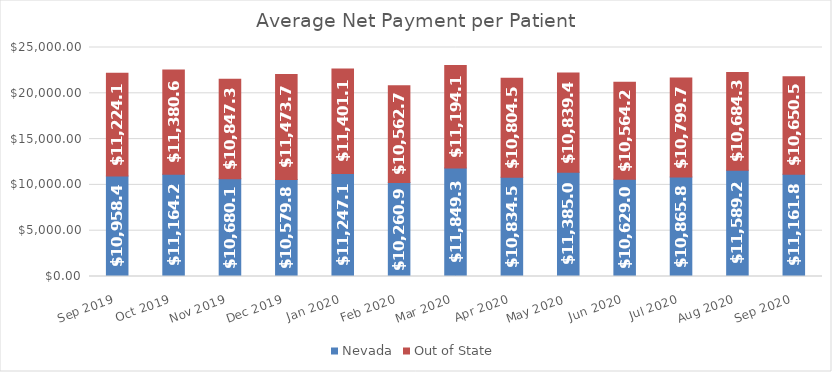
| Category | Nevada | Out of State |
|---|---|---|
| Sep 2019 | 10958.415 | 11224.099 |
| Oct 2019 | 11164.245 | 11380.648 |
| Nov 2019 | 10680.128 | 10847.342 |
| Dec 2019 | 10579.795 | 11473.718 |
| Jan 2020 | 11247.182 | 11401.169 |
| Feb 2020 | 10260.911 | 10562.727 |
| Mar 2020 | 11849.371 | 11194.114 |
| Apr 2020 | 10834.501 | 10804.574 |
| May 2020 | 11385.043 | 10839.434 |
| Jun 2020 | 10629.028 | 10564.264 |
| Jul 2020 | 10865.82 | 10799.772 |
| Aug 2020 | 11589.278 | 10684.308 |
| Sep 2020 | 11161.85 | 10650.521 |